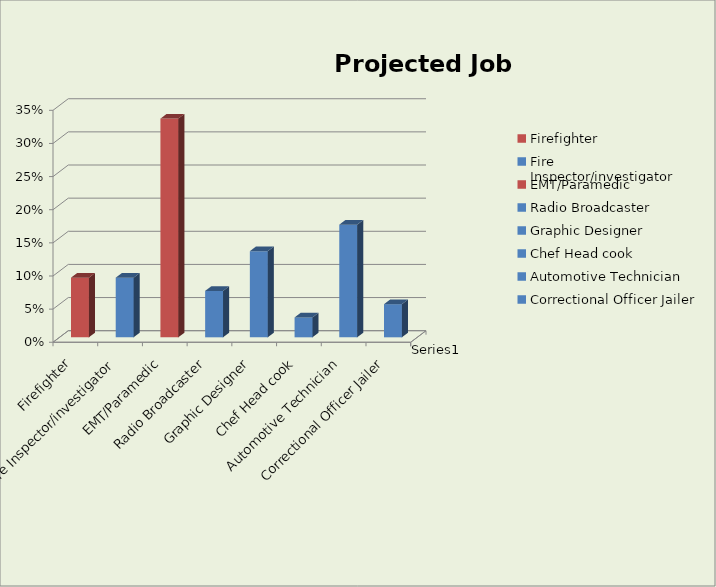
| Category | Series 0 |
|---|---|
| Firefighter | 0.09 |
| Fire Inspector/investigator | 0.09 |
| EMT/Paramedic | 0.33 |
| Radio Broadcaster | 0.07 |
| Graphic Designer  | 0.13 |
| Chef Head cook | 0.03 |
| Automotive Technician | 0.17 |
| Correctional Officer Jailer | 0.05 |